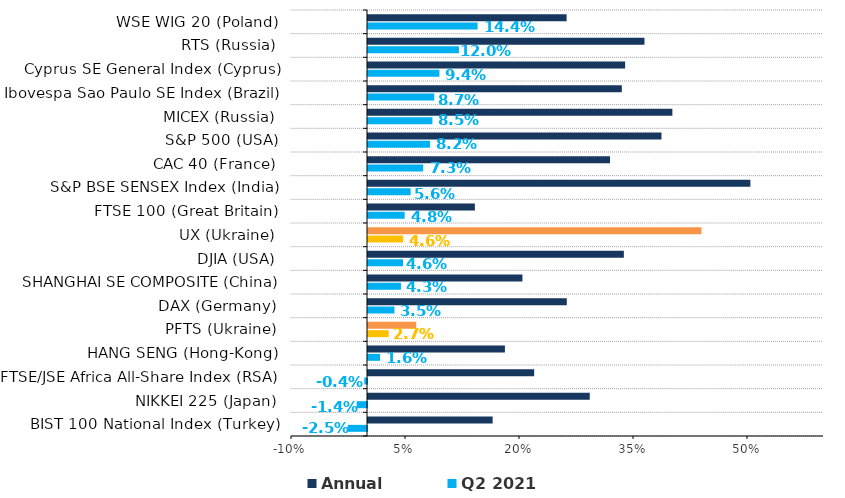
| Category | Q2 2021  | Annual |
|---|---|---|
| BIST 100 National Index (Тurkey) | -0.025 | 0.164 |
| NIKKEI 225 (Japan) | -0.014 | 0.292 |
| FTSE/JSE Africa All-Share Index (RSA) | -0.004 | 0.219 |
| HANG SENG (Hong-Kong) | 0.016 | 0.18 |
| PFTS (Ukraine) | 0.027 | 0.063 |
| DAX (Germany) | 0.035 | 0.262 |
| SHANGHAI SE COMPOSITE (China) | 0.043 | 0.203 |
| DJIA (USA) | 0.046 | 0.337 |
| UX (Ukraine) | 0.046 | 0.439 |
| FTSE 100 (Great Britain) | 0.048 | 0.141 |
| S&P BSE SENSEX Index (India) | 0.056 | 0.503 |
| CAC 40 (France) | 0.073 | 0.318 |
| S&P 500 (USA) | 0.082 | 0.386 |
| MICEX (Russia) | 0.085 | 0.4 |
| Ibovespa Sao Paulo SE Index (Brazil) | 0.087 | 0.334 |
| Cyprus SE General Index (Cyprus) | 0.094 | 0.338 |
| RTS (Russia) | 0.12 | 0.364 |
| WSE WIG 20 (Poland) | 0.144 | 0.261 |